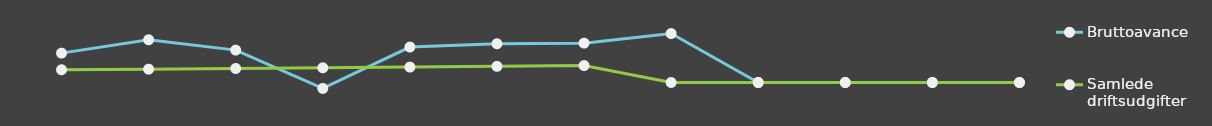
| Category | Bruttoavance | Samlede driftsudgifter |
|---|---|---|
| 0 | 25000 | 10841 |
| 1 | 36348 | 11367.25 |
| 2 | 27562 | 11919.82 |
| 3 | -5059.5 | 12500.01 |
| 4 | 30153.18 | 13109.21 |
| 5 | 32964.45 | 13748.86 |
| 6 | 33502.87 | 14420.51 |
| 7 | 41646 | 0 |
| 8 | 0 | 0 |
| 9 | 0 | 0 |
| 10 | 0 | 0 |
| 11 | 0 | 0 |